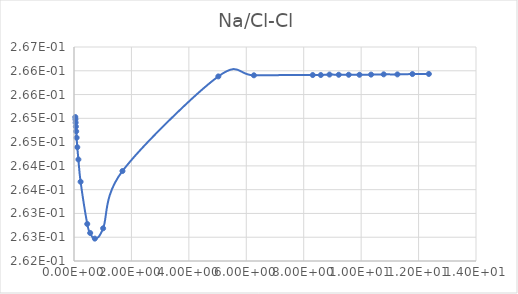
| Category | Series 0 |
|---|---|
| 0.045799 | 0.265 |
| 0.050887 | 0.265 |
| 0.057261 | 0.265 |
| 0.065458 | 0.265 |
| 0.076373 | 0.265 |
| 0.091688 | 0.265 |
| 0.11464 | 0.264 |
| 0.15299 | 0.264 |
| 0.22973 | 0.264 |
| 0.46172 | 0.263 |
| 0.56419 | 0.263 |
| 0.72511 | 0.262 |
| 1.0144 | 0.263 |
| 1.688 | 0.264 |
| 5.0263 | 0.266 |
| 6.2654 | 0.266 |
| 8.3152 | 0.266 |
| 8.5965 | 0.266 |
| 8.8974 | 0.266 |
| 9.2202 | 0.266 |
| 9.5673 | 0.266 |
| 9.9415 | 0.266 |
| 10.346 | 0.266 |
| 10.785 | 0.266 |
| 11.263 | 0.266 |
| 11.785 | 0.266 |
| 12.358 | 0.266 |